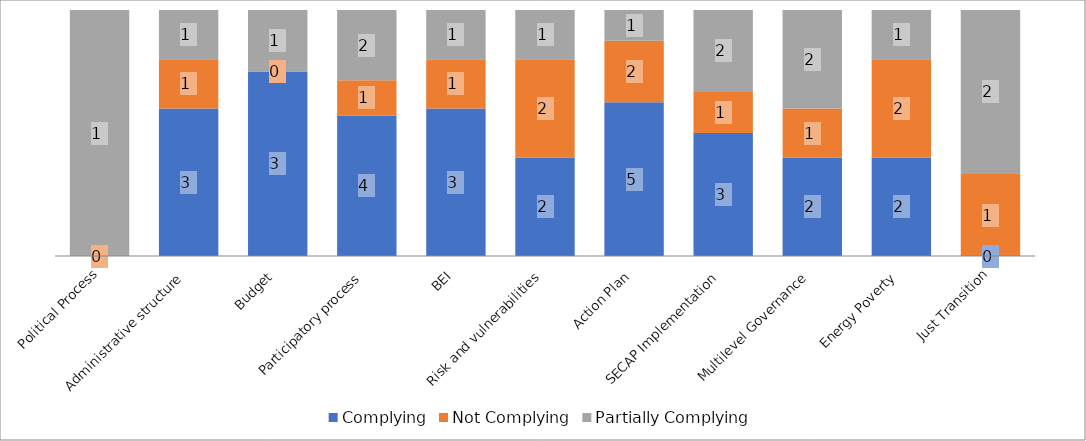
| Category | Complying | Not Complying | Partially Complying |
|---|---|---|---|
| Political Process | 0 | 0 | 1 |
| Administrative structure | 3 | 1 | 1 |
| Budget | 3 | 0 | 1 |
| Participatory process | 4 | 1 | 2 |
| BEI | 3 | 1 | 1 |
| Risk and vulnerabilities | 2 | 2 | 1 |
| Action Plan | 5 | 2 | 1 |
| SECAP Implementation | 3 | 1 | 2 |
| Multilevel Governance | 2 | 1 | 2 |
| Energy Poverty | 2 | 2 | 1 |
| Just Transition | 0 | 1 | 2 |